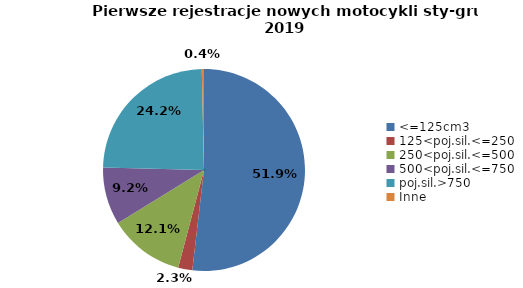
| Category | Series 0 |
|---|---|
| 0 | 9906 |
| 1 | 433 |
| 2 | 2312 |
| 3 | 1753 |
| 4 | 4632 |
| 5 | 67 |